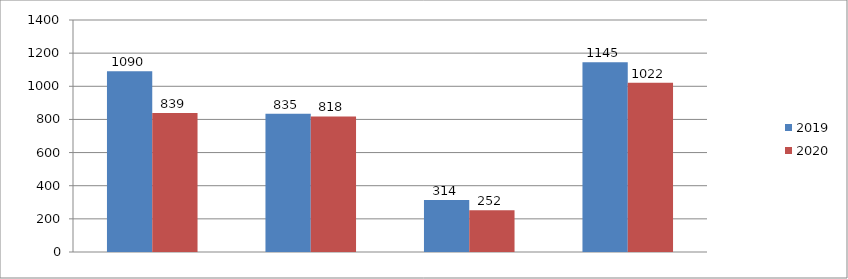
| Category | 2019 | 2020 |
|---|---|---|
| 0 | 1090 | 839 |
| 1 | 835 | 818 |
| 2 | 314 | 252 |
| 3 | 1145 | 1022 |